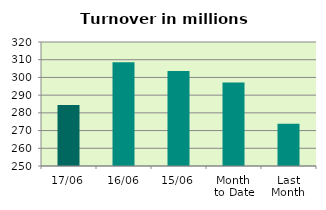
| Category | Series 0 |
|---|---|
| 17/06 | 284.366 |
| 16/06 | 308.546 |
| 15/06 | 303.586 |
| Month 
to Date | 297.161 |
| Last
Month | 273.813 |